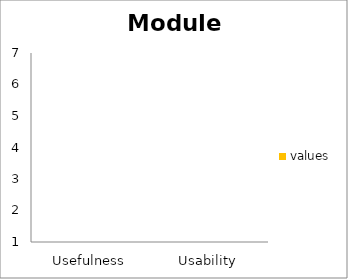
| Category | values |
|---|---|
| Usefulness | 0 |
| Usability | 0 |